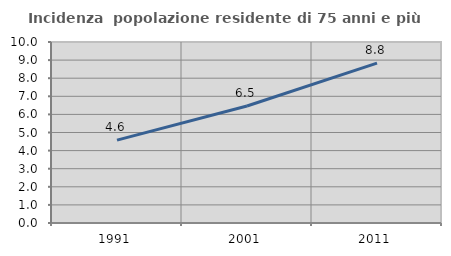
| Category | Incidenza  popolazione residente di 75 anni e più |
|---|---|
| 1991.0 | 4.577 |
| 2001.0 | 6.464 |
| 2011.0 | 8.83 |